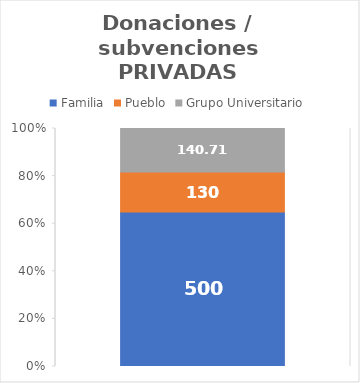
| Category | Familia | Pueblo | Grupo Universitario |
|---|---|---|---|
| 0 | 500 | 130 | 140.71 |